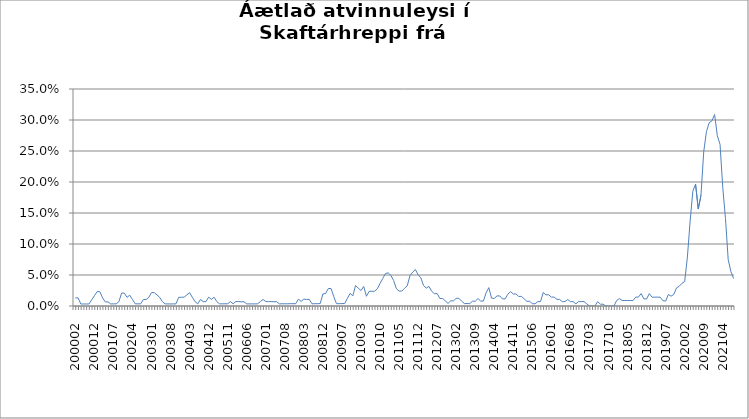
| Category | Series 0 |
|---|---|
| 200002 | 0.013 |
| 200003 | 0.013 |
| 200004 | 0.003 |
| 200005 | 0.003 |
| 200006 | 0.003 |
| 200007 | 0.003 |
| 200011 | 0.01 |
| 200012 | 0.017 |
| 200101 | 0.023 |
| 200102 | 0.023 |
| 200103 | 0.013 |
| 200104 | 0.007 |
| 200105 | 0.007 |
| 200106 | 0.003 |
| 200107 | 0.003 |
| 200108 | 0.003 |
| 200111 | 0.007 |
| 200112 | 0.021 |
| 200201 | 0.021 |
| 200202 | 0.014 |
| 200203 | 0.017 |
| 200204 | 0.01 |
| 200205 | 0.003 |
| 200206 | 0.003 |
| 200207 | 0.003 |
| 200210 | 0.01 |
| 200211 | 0.01 |
| 200212 | 0.014 |
| 200301 | 0.022 |
| 200302 | 0.022 |
| 200303 | 0.018 |
| 200304 | 0.014 |
| 200305 | 0.007 |
| 200306 | 0.003 |
| 200307 | 0.003 |
| 200308 | 0.003 |
| 200309 | 0.003 |
| 200310 | 0.004 |
| 200311 | 0.014 |
| 200312 | 0.014 |
| 200401 | 0.014 |
| 200402 | 0.018 |
| 200403 | 0.022 |
| 200404 | 0.014 |
| 200405 | 0.007 |
| 200406 | 0.004 |
| 200407 | 0.011 |
| 200408 | 0.007 |
| 200411 | 0.007 |
| 200412 | 0.014 |
| 200501 | 0.011 |
| 200502 | 0.014 |
| 200503 | 0.007 |
| 200504 | 0.004 |
| 200505 | 0.004 |
| 200510 | 0.004 |
| 200511 | 0.004 |
| 200512 | 0.007 |
| 200601 | 0.004 |
| 200602 | 0.007 |
| 200603 | 0.007 |
| 200604 | 0.007 |
| 200605 | 0.007 |
| 200606 | 0.003 |
| 200607 | 0.003 |
| 200608 | 0.003 |
| 200609 | 0.003 |
| 200610 | 0.004 |
| 200611 | 0.007 |
| 200612 | 0.011 |
| 200701 | 0.007 |
| 200702 | 0.007 |
| 200703 | 0.007 |
| 200704 | 0.007 |
| 200705 | 0.007 |
| 200706 | 0.003 |
| 200707 | 0.004 |
| 200708 | 0.004 |
| 200709 | 0.004 |
| 200710 | 0.004 |
| 200711 | 0.004 |
| 200712 | 0.004 |
| 200801 | 0.011 |
| 200802 | 0.007 |
| 200803 | 0.011 |
| 200804 | 0.011 |
| 200805 | 0.011 |
| 200806 | 0.004 |
| 200807 | 0.004 |
| 200808 | 0.004 |
| 200811 | 0.004 |
| 200812 | 0.019 |
| 200901 | 0.02 |
| 200902 | 0.028 |
| 200903 | 0.028 |
| 200904 | 0.015 |
| 200905 | 0.004 |
| 200906 | 0.004 |
| 200907 | 0.004 |
| 200908 | 0.004 |
| 200910 | 0.012 |
| 200911 | 0.02 |
| 200912 | 0.016 |
| 201001 | 0.033 |
| 201002 | 0.029 |
| 201003 | 0.025 |
| 201004 | 0.031 |
| 201005 | 0.016 |
| 201006 | 0.024 |
| 201007 | 0.024 |
| 201008 | 0.024 |
| 201009 | 0.028 |
| 201010 | 0.036 |
| 201011 | 0.044 |
| 201012 | 0.052 |
| 201101 | 0.053 |
| 201102 | 0.049 |
| 201103 | 0.041 |
| 201104 | 0.028 |
| 201105 | 0.024 |
| 201106 | 0.024 |
| 201107 | 0.028 |
| 201108 | 0.033 |
| 201109 | 0.049 |
| 201110 | 0.055 |
| 201111 | 0.059 |
| 201112 | 0.05 |
| 201201 | 0.045 |
| 201202 | 0.033 |
| 201203 | 0.029 |
| 201204 | 0.032 |
| 201205 | 0.024 |
| 201206 | 0.02 |
| 201207 | 0.02 |
| 201208 | 0.012 |
| 201209 | 0.012 |
| 201210 | 0.008 |
| 201211 | 0.004 |
| 201212 | 0.008 |
| 201301 | 0.008 |
| 201302 | 0.012 |
| 201303 | 0.012 |
| 201304 | 0.008 |
| 201305 | 0.004 |
| 201306 | 0.004 |
| 201307 | 0.004 |
| 201308 | 0.008 |
| 201309 | 0.008 |
| 201310 | 0.012 |
| 201311 | 0.008 |
| 201312 | 0.008 |
| 201401 | 0.021 |
| 201402 | 0.03 |
| 201403 | 0.013 |
| 201404 | 0.012 |
| 201405 | 0.016 |
| 201406 | 0.016 |
| 201407 | 0.011 |
| 201408 | 0.011 |
| 201409 | 0.019 |
| 201410 | 0.023 |
| 201411 | 0.019 |
| 201412 | 0.019 |
| 201501 | 0.015 |
| 201502 | 0.015 |
| 201503 | 0.012 |
| 201504 | 0.008 |
| 201505 | 0.008 |
| 201506 | 0.004 |
| 201507 | 0.004 |
| 201508 | 0.007 |
| 201509 | 0.007 |
| 201510 | 0.022 |
| 201511 | 0.018 |
| 201512 | 0.018 |
| 201601 | 0.014 |
| 201602 | 0.014 |
| 201603 | 0.011 |
| 201604 | 0.011 |
| 201605 | 0.007 |
| 201606 | 0.007 |
| 201607 | 0.011 |
| 201608 | 0.007 |
| 201609 | 0.007 |
| 201610 | 0.004 |
| 201611 | 0.007 |
| 201612 | 0.007 |
| 201701 | 0.007 |
| 201702 | 0.004 |
| 201703 | 0 |
| 201704 | 0 |
| 201705 | 0 |
| 201706 | 0.007 |
| 201707 | 0.003 |
| 201708 | 0.003 |
| 201709 | 0 |
| 201710 | 0 |
| 201711 | 0 |
| 201712 | 0 |
| 201801 | 0.009 |
| 201802 | 0.012 |
| 201803 | 0.009 |
| 201804 | 0.009 |
| 201805 | 0.009 |
| 201806 | 0.009 |
| 201807 | 0.009 |
| 201808 | 0.014 |
| 201809 | 0.014 |
| 201810 | 0.02 |
| 201811 | 0.011 |
| 201812 | 0.011 |
| 201901 | 0.02 |
| 201902 | 0.014 |
| 201903 | 0.014 |
| 201904 | 0.014 |
| 201905 | 0.014 |
| 201906 | 0.009 |
| 201907 | 0.008 |
| 201908 | 0.019 |
| 201909 | 0.016 |
| 201910 | 0.019 |
| 201911 | 0.029 |
| 201912 | 0.032 |
| 202001 | 0.037 |
| 202002 | 0.039 |
| 202003 | 0.079 |
| 202004 | 0.137 |
| 202005 | 0.185 |
| 202006 | 0.197 |
| 202007 | 0.156 |
| 202008 | 0.179 |
| 202009 | 0.249 |
| 202010 | 0.281 |
| 202011 | 0.296 |
| 202012 | 0.299 |
| 202101 | 0.309 |
| 202102 | 0.275 |
| 202103 | 0.261 |
| 202104 | 0.191 |
| 202105 | 0.141 |
| 202106 | 0.075 |
| 202107 | 0.055 |
| 202108 | 0.044 |